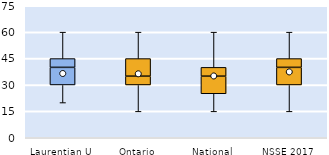
| Category | 25th | 50th | 75th |
|---|---|---|---|
| Laurentian U | 30 | 10 | 5 |
| Ontario | 30 | 5 | 10 |
| National | 25 | 10 | 5 |
| NSSE 2017 | 30 | 10 | 5 |